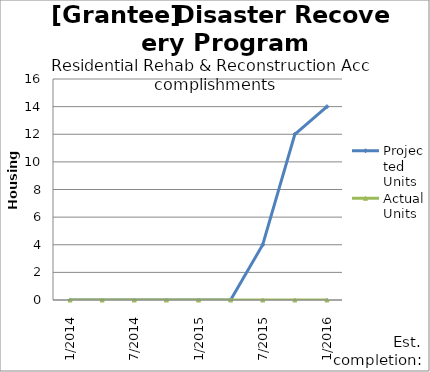
| Category | Projected Units | Actual Units |
|---|---|---|
| 1/2014 | 0 | 0 |
| 4/2014 | 0 | 0 |
| 7/2014 | 0 | 0 |
| 10/2014 | 0 | 0 |
| 1/2015 | 0 | 0 |
| 4/2015 | 0 | 0 |
| 7/2015 | 4 | 0 |
| 10/2015 | 12 | 0 |
| 1/2016 | 14 | 0 |